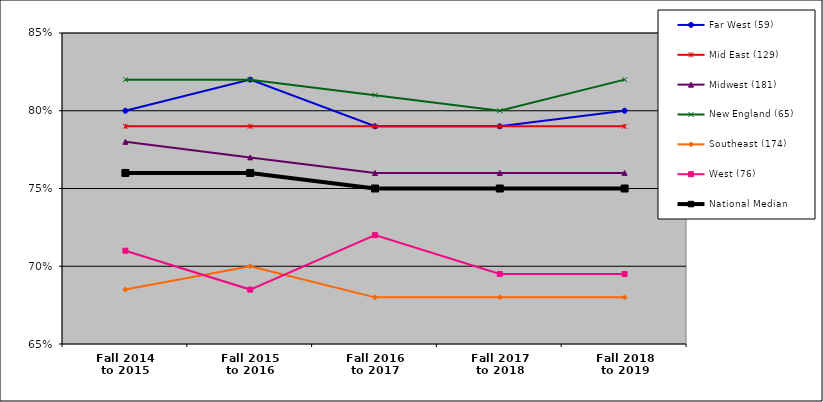
| Category | Far West (59) | Mid East (129) | Midwest (181) | New England (65) | Southeast (174) | West (76) | National Median |
|---|---|---|---|---|---|---|---|
| Fall 2014
to 2015 | 0.8 | 0.79 | 0.78 | 0.82 | 0.685 | 0.71 | 0.76 |
| Fall 2015
to 2016 | 0.82 | 0.79 | 0.77 | 0.82 | 0.7 | 0.685 | 0.76 |
| Fall 2016
to 2017 | 0.79 | 0.79 | 0.76 | 0.81 | 0.68 | 0.72 | 0.75 |
| Fall 2017
to 2018 | 0.79 | 0.79 | 0.76 | 0.8 | 0.68 | 0.695 | 0.75 |
| Fall 2018
to 2019 | 0.8 | 0.79 | 0.76 | 0.82 | 0.68 | 0.695 | 0.75 |